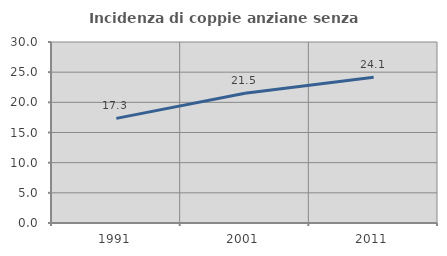
| Category | Incidenza di coppie anziane senza figli  |
|---|---|
| 1991.0 | 17.346 |
| 2001.0 | 21.513 |
| 2011.0 | 24.148 |